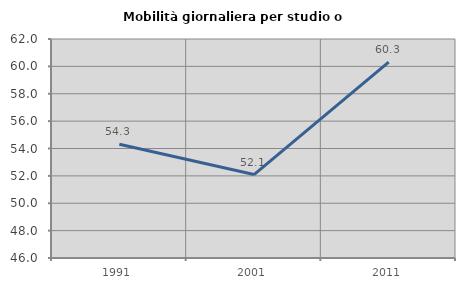
| Category | Mobilità giornaliera per studio o lavoro |
|---|---|
| 1991.0 | 54.313 |
| 2001.0 | 52.094 |
| 2011.0 | 60.308 |